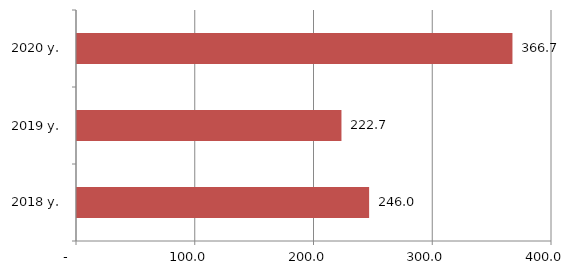
| Category | Series 0 |
|---|---|
| 2018 y. | 246 |
| 2019 y. | 222.7 |
| 2020 y. | 366.7 |